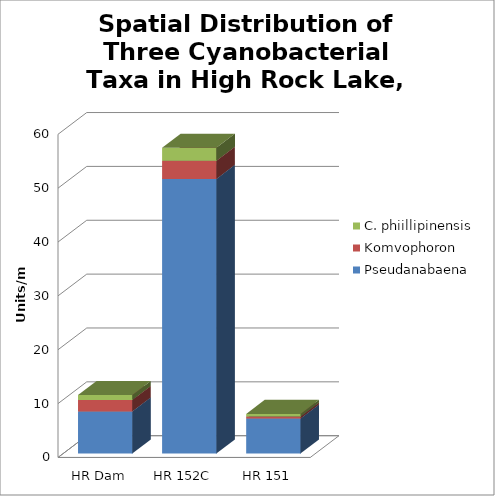
| Category | Pseudanabaena | Komvophoron | C. phiillipinensis |
|---|---|---|---|
| HR Dam | 7834 | 2125 | 917 |
| HR 152C | 51000 | 3375 | 2417 |
| HR 151 | 6500 | 375 | 500 |